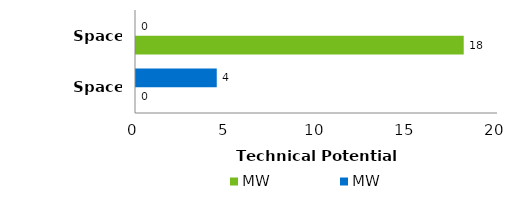
| Category | MW |
|---|---|
| Space Heating | 4.462 |
| Space Cooling | 0 |